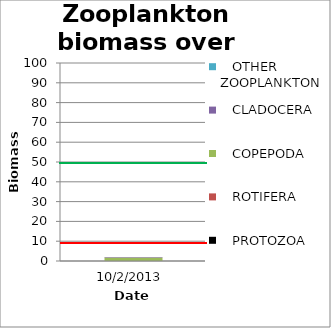
| Category |    PROTOZOA |    ROTIFERA |    COPEPODA |    CLADOCERA |    OTHER ZOOPLANKTON |
|---|---|---|---|---|---|
| 10/2/13 | 0 | 0.034 | 1.719 | 0.274 | 0 |